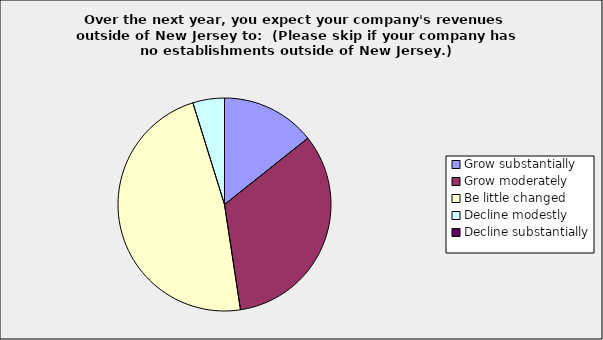
| Category | Series 0 |
|---|---|
| Grow substantially | 0.143 |
| Grow moderately | 0.333 |
| Be little changed | 0.476 |
| Decline modestly | 0.048 |
| Decline substantially | 0 |